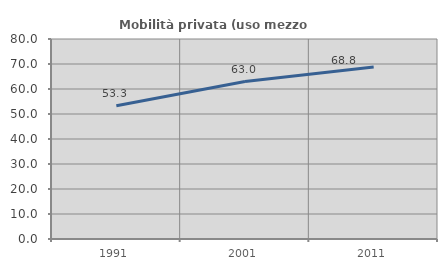
| Category | Mobilità privata (uso mezzo privato) |
|---|---|
| 1991.0 | 53.301 |
| 2001.0 | 62.979 |
| 2011.0 | 68.768 |